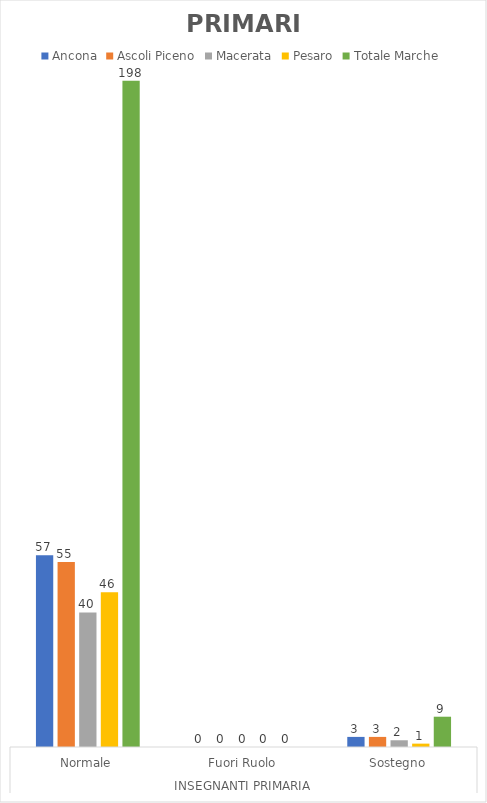
| Category | Ancona | Ascoli Piceno | Macerata | Pesaro | Totale Marche |
|---|---|---|---|---|---|
| 0 | 57 | 55 | 40 | 46 | 198 |
| 1 | 0 | 0 | 0 | 0 | 0 |
| 2 | 3 | 3 | 2 | 1 | 9 |